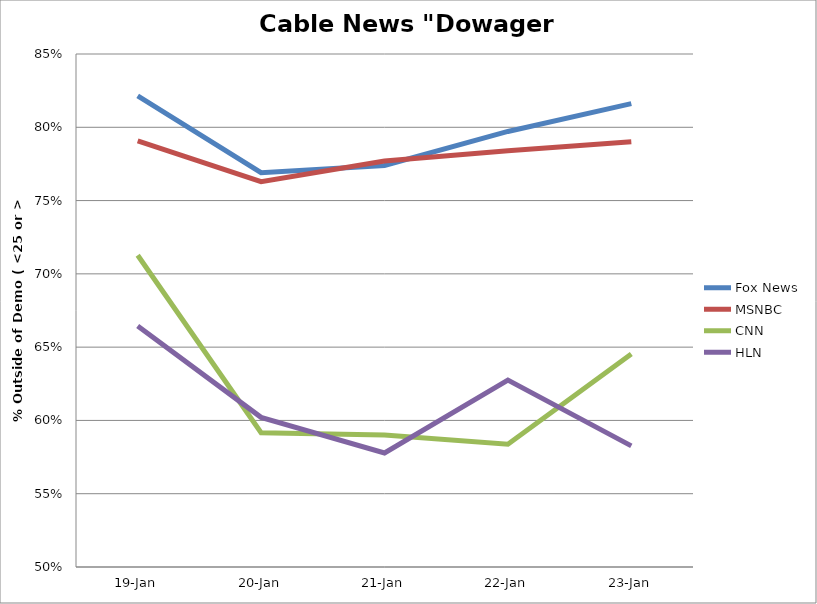
| Category | Fox News | MSNBC | CNN | HLN |
|---|---|---|---|---|
| 2015-01-23 | 0.816 | 0.79 | 0.645 | 0.583 |
| 2015-01-22 | 0.797 | 0.784 | 0.584 | 0.628 |
| 2015-01-21 | 0.774 | 0.777 | 0.59 | 0.578 |
| 2015-01-20 | 0.769 | 0.763 | 0.592 | 0.602 |
| 2015-01-19 | 0.821 | 0.791 | 0.713 | 0.664 |